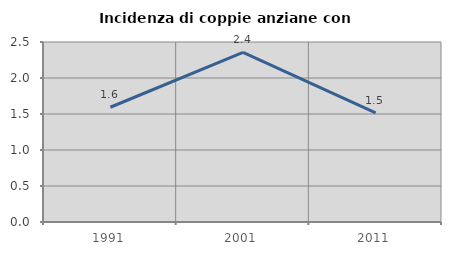
| Category | Incidenza di coppie anziane con figli |
|---|---|
| 1991.0 | 1.594 |
| 2001.0 | 2.357 |
| 2011.0 | 1.515 |